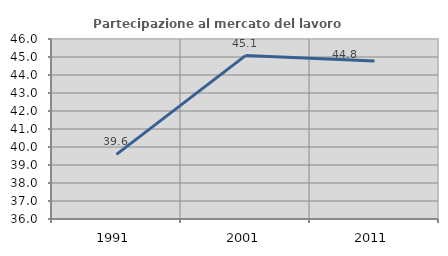
| Category | Partecipazione al mercato del lavoro  femminile |
|---|---|
| 1991.0 | 39.592 |
| 2001.0 | 45.079 |
| 2011.0 | 44.772 |